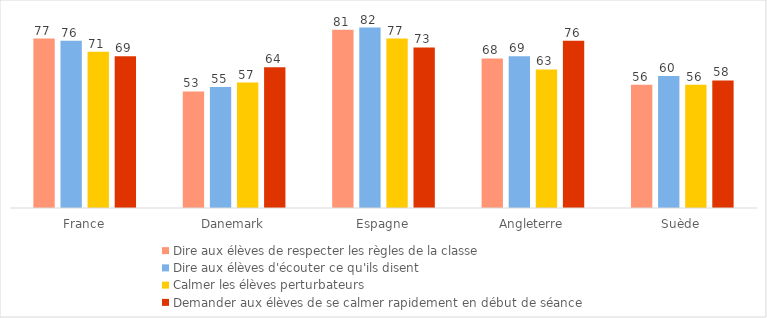
| Category | Dire aux élèves de respecter les règles de la classe | Dire aux élèves d'écouter ce qu'ils disent | Calmer les élèves perturbateurs | Demander aux élèves de se calmer rapidement en début de séance |
|---|---|---|---|---|
| France | 77 | 76 | 71 | 69 |
| Danemark | 53 | 55 | 57 | 64 |
| Espagne | 81 | 82 | 77 | 73 |
| Angleterre | 68 | 69 | 63 | 76 |
| Suède | 56 | 60 | 56 | 58 |